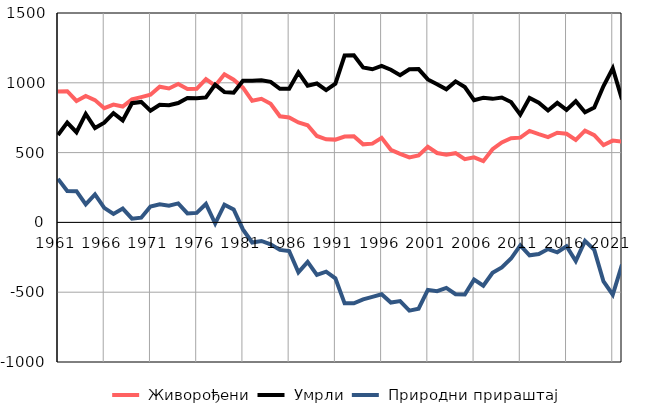
| Category |  Живорођени |  Умрли |  Природни прираштај |
|---|---|---|---|
| 1961.0 | 938 | 626 | 312 |
| 1962.0 | 940 | 715 | 225 |
| 1963.0 | 870 | 646 | 224 |
| 1964.0 | 906 | 777 | 129 |
| 1965.0 | 876 | 676 | 200 |
| 1966.0 | 818 | 714 | 104 |
| 1967.0 | 844 | 783 | 61 |
| 1968.0 | 830 | 731 | 99 |
| 1969.0 | 881 | 854 | 27 |
| 1970.0 | 897 | 863 | 34 |
| 1971.0 | 914 | 800 | 114 |
| 1972.0 | 972 | 842 | 130 |
| 1973.0 | 959 | 839 | 120 |
| 1974.0 | 991 | 855 | 136 |
| 1975.0 | 955 | 891 | 64 |
| 1976.0 | 957 | 889 | 68 |
| 1977.0 | 1027 | 895 | 132 |
| 1978.0 | 979 | 987 | -8 |
| 1979.0 | 1061 | 934 | 127 |
| 1980.0 | 1022 | 929 | 93 |
| 1981.0 | 965 | 1015 | -50 |
| 1982.0 | 871 | 1015 | -144 |
| 1983.0 | 885 | 1018 | -133 |
| 1984.0 | 850 | 1007 | -157 |
| 1985.0 | 760 | 957 | -197 |
| 1986.0 | 752 | 957 | -205 |
| 1987.0 | 716 | 1074 | -358 |
| 1988.0 | 696 | 979 | -283 |
| 1989.0 | 619 | 995 | -376 |
| 1990.0 | 595 | 948 | -353 |
| 1991.0 | 593 | 994 | -401 |
| 1992.0 | 615 | 1195 | -580 |
| 1993.0 | 617 | 1197 | -580 |
| 1994.0 | 559 | 1110 | -551 |
| 1995.0 | 564 | 1097 | -533 |
| 1996.0 | 606 | 1121 | -515 |
| 1997.0 | 520 | 1094 | -574 |
| 1998.0 | 491 | 1055 | -564 |
| 1999.0 | 465 | 1097 | -632 |
| 2000.0 | 480 | 1098 | -618 |
| 2001.0 | 541 | 1024 | -483 |
| 2002.0 | 497 | 990 | -493 |
| 2003.0 | 485 | 954 | -469 |
| 2004.0 | 496 | 1010 | -514 |
| 2005.0 | 453 | 970 | -517 |
| 2006.0 | 466 | 876 | -410 |
| 2007.0 | 439 | 893 | -454 |
| 2008.0 | 524 | 885 | -361 |
| 2009.0 | 573 | 895 | -322 |
| 2010.0 | 603 | 862 | -259 |
| 2011.0 | 607 | 772 | -165 |
| 2012.0 | 655 | 891 | -236 |
| 2013.0 | 632 | 858 | -226 |
| 2014.0 | 611 | 802 | -191 |
| 2015.0 | 642 | 856 | -214 |
| 2016.0 | 635 | 806 | -171 |
| 2017.0 | 591 | 868 | -277 |
| 2018.0 | 657 | 789 | -132 |
| 2019.0 | 625 | 822 | -197 |
| 2020.0 | 554 | 977 | -423 |
| 2021.0 | 586 | 1104 | -518 |
| 2022.0 | 579 | 881 | -302 |